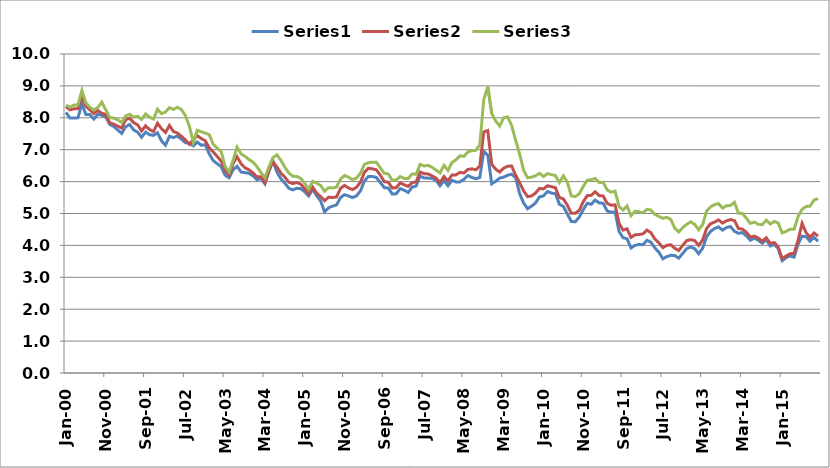
| Category | Series 0 | Series 1 | Series 2 |
|---|---|---|---|
| 2000-01-01 | 8.17 | 8.35 | 8.4 |
| 2000-02-01 | 7.99 | 8.25 | 8.33 |
| 2000-03-01 | 7.99 | 8.28 | 8.4 |
| 2000-04-01 | 8 | 8.29 | 8.4 |
| 2000-05-01 | 8.44 | 8.7 | 8.86 |
| 2000-06-01 | 8.1 | 8.36 | 8.47 |
| 2000-07-01 | 8.1 | 8.25 | 8.33 |
| 2000-08-01 | 7.96 | 8.13 | 8.25 |
| 2000-09-01 | 8.11 | 8.23 | 8.32 |
| 2000-10-01 | 8.08 | 8.14 | 8.49 |
| 2000-11-01 | 8.03 | 8.11 | 8.25 |
| 2000-12-01 | 7.79 | 7.84 | 8.01 |
| 2001-01-01 | 7.73 | 7.8 | 7.99 |
| 2001-02-01 | 7.62 | 7.74 | 7.94 |
| 2001-03-01 | 7.51 | 7.68 | 7.85 |
| 2001-04-01 | 7.72 | 7.94 | 8.06 |
| 2001-05-01 | 7.79 | 7.99 | 8.11 |
| 2001-06-01 | 7.62 | 7.85 | 8.02 |
| 2001-07-01 | 7.55 | 7.78 | 8.05 |
| 2001-08-01 | 7.39 | 7.59 | 7.95 |
| 2001-09-01 | 7.55 | 7.75 | 8.12 |
| 2001-10-01 | 7.47 | 7.63 | 8.02 |
| 2001-11-01 | 7.45 | 7.57 | 7.96 |
| 2001-12-01 | 7.53 | 7.83 | 8.27 |
| 2002-01-01 | 7.28 | 7.66 | 8.13 |
| 2002-02-01 | 7.14 | 7.54 | 8.18 |
| 2002-03-01 | 7.42 | 7.76 | 8.32 |
| 2002-04-01 | 7.38 | 7.57 | 8.26 |
| 2002-05-01 | 7.43 | 7.52 | 8.33 |
| 2002-06-01 | 7.33 | 7.42 | 8.26 |
| 2002-07-01 | 7.22 | 7.31 | 8.07 |
| 2002-08-01 | 7.2 | 7.17 | 7.74 |
| 2002-09-01 | 7.12 | 7.32 | 7.23 |
| 2002-10-01 | 7.24 | 7.44 | 7.61 |
| 2002-11-01 | 7.14 | 7.35 | 7.56 |
| 2002-12-01 | 7.16 | 7.28 | 7.52 |
| 2003-01-01 | 6.87 | 7.06 | 7.47 |
| 2003-02-01 | 6.66 | 6.93 | 7.17 |
| 2003-03-01 | 6.56 | 6.79 | 7.05 |
| 2003-04-01 | 6.47 | 6.64 | 6.94 |
| 2003-05-01 | 6.2 | 6.36 | 6.47 |
| 2003-06-01 | 6.12 | 6.21 | 6.3 |
| 2003-07-01 | 6.37 | 6.57 | 6.67 |
| 2003-08-01 | 6.48 | 6.78 | 7.08 |
| 2003-09-01 | 6.3 | 6.56 | 6.87 |
| 2003-10-01 | 6.28 | 6.43 | 6.79 |
| 2003-11-01 | 6.26 | 6.37 | 6.69 |
| 2003-12-01 | 6.18 | 6.27 | 6.61 |
| 2004-01-01 | 6.06 | 6.15 | 6.47 |
| 2004-02-01 | 6.1 | 6.15 | 6.28 |
| 2004-03-01 | 5.93 | 5.97 | 6.12 |
| 2004-04-01 | 6.33 | 6.35 | 6.46 |
| 2004-05-01 | 6.66 | 6.62 | 6.75 |
| 2004-06-01 | 6.3 | 6.46 | 6.84 |
| 2004-07-01 | 6.09 | 6.27 | 6.67 |
| 2004-08-01 | 5.95 | 6.14 | 6.45 |
| 2004-09-01 | 5.79 | 5.98 | 6.27 |
| 2004-10-01 | 5.74 | 5.94 | 6.17 |
| 2004-11-01 | 5.79 | 5.97 | 6.16 |
| 2004-12-01 | 5.78 | 5.92 | 6.1 |
| 2005-01-01 | 5.68 | 5.78 | 5.95 |
| 2005-02-01 | 5.55 | 5.61 | 5.76 |
| 2005-03-01 | 5.76 | 5.83 | 6.01 |
| 2005-04-01 | 5.56 | 5.64 | 5.95 |
| 2005-05-01 | 5.39 | 5.53 | 5.88 |
| 2005-06-01 | 5.05 | 5.4 | 5.7 |
| 2005-07-01 | 5.18 | 5.51 | 5.81 |
| 2005-08-01 | 5.23 | 5.5 | 5.8 |
| 2005-09-01 | 5.27 | 5.52 | 5.83 |
| 2005-10-01 | 5.5 | 5.79 | 6.08 |
| 2005-11-01 | 5.59 | 5.88 | 6.19 |
| 2005-12-01 | 5.55 | 5.8 | 6.14 |
| 2006-01-01 | 5.5 | 5.75 | 6.06 |
| 2006-02-01 | 5.55 | 5.82 | 6.11 |
| 2006-03-01 | 5.71 | 5.98 | 6.26 |
| 2006-04-01 | 6.02 | 6.29 | 6.54 |
| 2006-05-01 | 6.16 | 6.42 | 6.59 |
| 2006-06-01 | 6.16 | 6.4 | 6.61 |
| 2006-07-01 | 6.13 | 6.37 | 6.61 |
| 2006-08-01 | 5.97 | 6.2 | 6.43 |
| 2006-09-01 | 5.81 | 6 | 6.26 |
| 2006-10-01 | 5.8 | 5.98 | 6.24 |
| 2006-11-01 | 5.61 | 5.8 | 6.04 |
| 2006-12-01 | 5.62 | 5.81 | 6.05 |
| 2007-01-01 | 5.78 | 5.96 | 6.16 |
| 2007-02-01 | 5.73 | 5.9 | 6.1 |
| 2007-03-01 | 5.66 | 5.85 | 6.1 |
| 2007-04-01 | 5.83 | 5.97 | 6.24 |
| 2007-05-01 | 5.86 | 5.99 | 6.23 |
| 2007-06-01 | 6.18 | 6.3 | 6.54 |
| 2007-07-01 | 6.11 | 6.25 | 6.49 |
| 2007-08-01 | 6.11 | 6.24 | 6.51 |
| 2007-09-01 | 6.1 | 6.18 | 6.45 |
| 2007-10-01 | 6.04 | 6.11 | 6.36 |
| 2007-11-01 | 5.87 | 5.97 | 6.27 |
| 2007-12-01 | 6.03 | 6.16 | 6.51 |
| 2008-01-01 | 5.87 | 6.02 | 6.35 |
| 2008-02-01 | 6.04 | 6.21 | 6.6 |
| 2008-03-01 | 5.99 | 6.21 | 6.68 |
| 2008-04-01 | 5.99 | 6.29 | 6.81 |
| 2008-05-01 | 6.07 | 6.27 | 6.79 |
| 2008-06-01 | 6.19 | 6.38 | 6.93 |
| 2008-07-01 | 6.13 | 6.4 | 6.97 |
| 2008-08-01 | 6.09 | 6.37 | 6.98 |
| 2008-09-01 | 6.13 | 6.49 | 7.15 |
| 2008-10-01 | 6.95 | 7.56 | 8.58 |
| 2008-11-01 | 6.83 | 7.6 | 8.98 |
| 2008-12-01 | 5.93 | 6.54 | 8.13 |
| 2009-01-01 | 6.01 | 6.39 | 7.9 |
| 2009-02-01 | 6.11 | 6.3 | 7.74 |
| 2009-03-01 | 6.14 | 6.42 | 8 |
| 2009-04-01 | 6.2 | 6.48 | 8.03 |
| 2009-05-01 | 6.23 | 6.49 | 7.76 |
| 2009-06-01 | 6.13 | 6.2 | 7.3 |
| 2009-07-01 | 5.63 | 5.97 | 6.87 |
| 2009-08-01 | 5.33 | 5.71 | 6.36 |
| 2009-09-01 | 5.15 | 5.53 | 6.12 |
| 2009-10-01 | 5.23 | 5.55 | 6.14 |
| 2009-11-01 | 5.33 | 5.64 | 6.18 |
| 2009-12-01 | 5.52 | 5.79 | 6.26 |
| 2010-01-01 | 5.55 | 5.77 | 6.16 |
| 2010-02-01 | 5.69 | 5.87 | 6.25 |
| 2010-03-01 | 5.64 | 5.84 | 6.22 |
| 2010-04-01 | 5.62 | 5.81 | 6.19 |
| 2010-05-01 | 5.29 | 5.5 | 5.97 |
| 2010-06-01 | 5.22 | 5.46 | 6.18 |
| 2010-07-01 | 4.99 | 5.26 | 5.98 |
| 2010-08-01 | 4.75 | 5.01 | 5.55 |
| 2010-09-01 | 4.74 | 5.01 | 5.53 |
| 2010-10-01 | 4.89 | 5.1 | 5.62 |
| 2010-11-01 | 5.12 | 5.37 | 5.85 |
| 2010-12-01 | 5.32 | 5.56 | 6.04 |
| 2011-01-01 | 5.29 | 5.57 | 6.06 |
| 2011-02-01 | 5.42 | 5.68 | 6.1 |
| 2011-03-01 | 5.33 | 5.56 | 5.97 |
| 2011-04-01 | 5.32 | 5.55 | 5.98 |
| 2011-05-01 | 5.08 | 5.32 | 5.74 |
| 2011-06-01 | 5.04 | 5.26 | 5.67 |
| 2011-07-01 | 5.05 | 5.27 | 5.7 |
| 2011-08-01 | 4.44 | 4.69 | 5.22 |
| 2011-09-01 | 4.24 | 4.48 | 5.11 |
| 2011-10-01 | 4.21 | 4.52 | 5.24 |
| 2011-11-01 | 3.92 | 4.25 | 4.93 |
| 2011-12-01 | 4 | 4.33 | 5.07 |
| 2012-01-01 | 4.03 | 4.34 | 5.06 |
| 2012-02-01 | 4.02 | 4.36 | 5.02 |
| 2012-03-01 | 4.16 | 4.48 | 5.13 |
| 2012-04-01 | 4.1 | 4.4 | 5.11 |
| 2012-05-01 | 3.92 | 4.2 | 4.97 |
| 2012-06-01 | 3.79 | 4.08 | 4.91 |
| 2012-07-01 | 3.58 | 3.93 | 4.85 |
| 2012-08-01 | 3.65 | 4 | 4.88 |
| 2012-09-01 | 3.69 | 4.02 | 4.81 |
| 2012-10-01 | 3.68 | 3.91 | 4.54 |
| 2012-11-01 | 3.6 | 3.84 | 4.42 |
| 2012-12-01 | 3.75 | 4 | 4.56 |
| 2013-01-01 | 3.9 | 4.15 | 4.66 |
| 2013-02-01 | 3.95 | 4.18 | 4.74 |
| 2013-03-01 | 3.9 | 4.15 | 4.66 |
| 2013-04-01 | 3.74 | 4 | 4.49 |
| 2013-05-01 | 3.91 | 4.17 | 4.65 |
| 2013-06-01 | 4.27 | 4.53 | 5.08 |
| 2013-07-01 | 4.44 | 4.68 | 5.21 |
| 2013-08-01 | 4.53 | 4.73 | 5.28 |
| 2013-09-01 | 4.58 | 4.8 | 5.31 |
| 2013-10-01 | 4.48 | 4.7 | 5.17 |
| 2013-11-01 | 4.56 | 4.77 | 5.24 |
| 2013-12-01 | 4.59 | 4.81 | 5.25 |
| 2014-01-01 | 4.44 | 4.778 | 5.351 |
| 2014-02-01 | 4.38 | 4.53 | 5.01 |
| 2014-03-01 | 4.4 | 4.51 | 5 |
| 2014-04-01 | 4.3 | 4.41 | 4.85 |
| 2014-05-01 | 4.16 | 4.26 | 4.69 |
| 2014-06-01 | 4.23 | 4.29 | 4.73 |
| 2014-07-01 | 4.16 | 4.23 | 4.66 |
| 2014-08-01 | 4.07 | 4.13 | 4.65 |
| 2014-09-01 | 4.18 | 4.24 | 4.79 |
| 2014-10-01 | 3.98 | 4.06 | 4.67 |
| 2014-11-01 | 4.03 | 4.09 | 4.75 |
| 2014-12-01 | 3.9 | 3.95 | 4.7 |
| 2015-01-01 | 3.52 | 3.58 | 4.39 |
| 2015-02-01 | 3.62 | 3.67 | 4.44 |
| 2015-03-01 | 3.67 | 3.74 | 4.51 |
| 2015-04-01 | 3.63 | 3.75 | 4.51 |
| 2015-05-01 | 4.05 | 4.17 | 4.91 |
| 2015-06-01 | 4.29 | 4.69 | 5.13 |
| 2015-07-01 | 4.27 | 4.4 | 5.22 |
| 2015-08-01 | 4.13 | 4.25 | 5.23 |
| 2015-09-01 | 4.25 | 4.39 | 5.42 |
| 2015-10-01 | 4.13 | 4.29 | 5.47 |